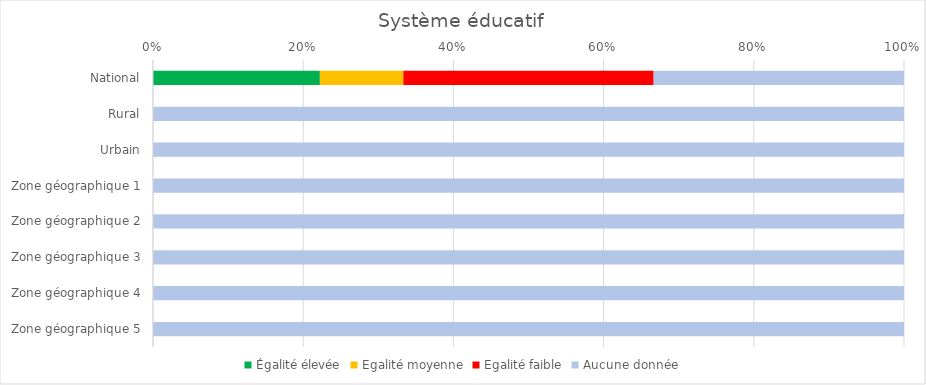
| Category | Égalité élevée | Egalité moyenne | Egalité faible | Aucune donnée |
|---|---|---|---|---|
| National | 2 | 1 | 3 | 3 |
| Rural | 0 | 0 | 0 | 4 |
| Urbain | 0 | 0 | 0 | 4 |
| Zone géographique 1 | 0 | 0 | 0 | 4 |
| Zone géographique 2 | 0 | 0 | 0 | 4 |
| Zone géographique 3 | 0 | 0 | 0 | 4 |
| Zone géographique 4 | 0 | 0 | 0 | 4 |
| Zone géographique 5 | 0 | 0 | 0 | 4 |